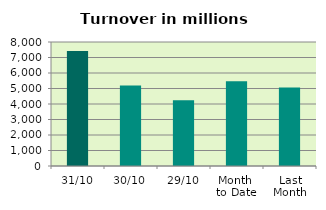
| Category | Series 0 |
|---|---|
| 31/10 | 7417.937 |
| 30/10 | 5200.859 |
| 29/10 | 4235.484 |
| Month 
to Date | 5472.473 |
| Last
Month | 5068.328 |